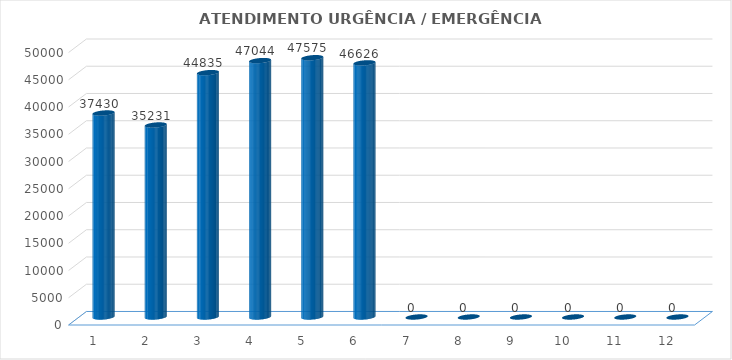
| Category | Series 0 |
|---|---|
| 0 | 37430 |
| 1 | 35231 |
| 2 | 44835 |
| 3 | 47044 |
| 4 | 47575 |
| 5 | 46626 |
| 6 | 0 |
| 7 | 0 |
| 8 | 0 |
| 9 | 0 |
| 10 | 0 |
| 11 | 0 |